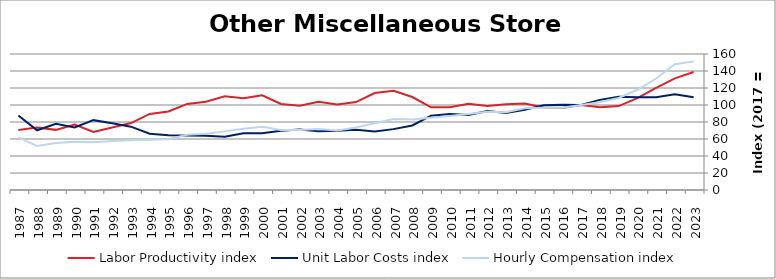
| Category | Labor Productivity index | Unit Labor Costs index | Hourly Compensation index |
|---|---|---|---|
| 2023.0 | 138.76 | 109.048 | 151.315 |
| 2022.0 | 131.356 | 112.615 | 147.927 |
| 2021.0 | 120.131 | 109.159 | 131.134 |
| 2020.0 | 108.178 | 108.993 | 117.906 |
| 2019.0 | 98.733 | 109.688 | 108.298 |
| 2018.0 | 97.259 | 106.054 | 103.148 |
| 2017.0 | 100 | 100 | 100 |
| 2016.0 | 96.469 | 100.37 | 96.826 |
| 2015.0 | 96.974 | 99.634 | 96.619 |
| 2014.0 | 101.815 | 94.444 | 96.158 |
| 2013.0 | 100.929 | 90.584 | 91.425 |
| 2012.0 | 98.975 | 92.889 | 91.937 |
| 2011.0 | 101.509 | 88.166 | 89.497 |
| 2010.0 | 97.377 | 89.505 | 87.157 |
| 2009.0 | 97.247 | 87.428 | 85.02 |
| 2008.0 | 109.377 | 75.923 | 83.042 |
| 2007.0 | 116.635 | 71.622 | 83.537 |
| 2006.0 | 114.015 | 68.866 | 78.518 |
| 2005.0 | 103.458 | 70.985 | 73.439 |
| 2004.0 | 100.573 | 69.658 | 70.057 |
| 2003.0 | 103.909 | 68.995 | 71.692 |
| 2002.0 | 99.152 | 71.154 | 70.55 |
| 2001.0 | 101.22 | 69.682 | 70.532 |
| 2000.0 | 111.436 | 66.8 | 74.44 |
| 1999.0 | 107.848 | 66.798 | 72.041 |
| 1998.0 | 110.161 | 62.6 | 68.961 |
| 1997.0 | 103.861 | 63.789 | 66.252 |
| 1996.0 | 101.296 | 64.065 | 64.895 |
| 1995.0 | 92.451 | 64.551 | 59.677 |
| 1994.0 | 89.535 | 66.13 | 59.209 |
| 1993.0 | 78.748 | 74.508 | 58.674 |
| 1992.0 | 73.5 | 78.485 | 57.687 |
| 1991.0 | 68.207 | 82.174 | 56.049 |
| 1990.0 | 77.025 | 73.649 | 56.728 |
| 1989.0 | 70.747 | 77.993 | 55.178 |
| 1988.0 | 73.529 | 70.263 | 51.664 |
| 1987.0 | 70.61 | 87.546 | 61.816 |